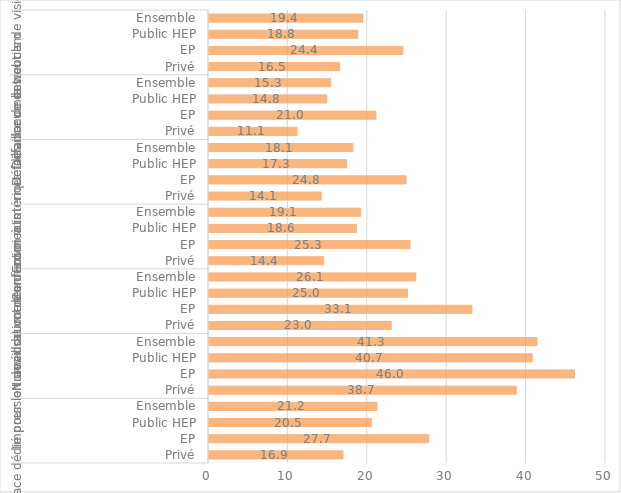
| Category | Oui |
|---|---|
| 0 | 16.88 |
| 1 | 27.67 |
| 2 | 20.46 |
| 3 | 21.16 |
| 4 | 38.69 |
| 5 | 46.03 |
| 6 | 40.7 |
| 7 | 41.31 |
| 8 | 22.95 |
| 9 | 33.11 |
| 10 | 25.01 |
| 11 | 26.06 |
| 12 | 14.44 |
| 13 | 25.32 |
| 14 | 18.57 |
| 15 | 19.12 |
| 16 | 14.13 |
| 17 | 24.82 |
| 18 | 17.34 |
| 19 | 18.13 |
| 20 | 11.09 |
| 21 | 21.03 |
| 22 | 14.83 |
| 23 | 15.34 |
| 24 | 16.45 |
| 25 | 24.42 |
| 26 | 18.75 |
| 27 | 19.37 |